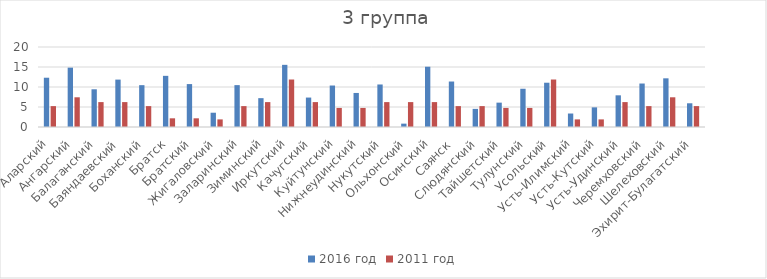
| Category | 2016 год | 2011 год |
|---|---|---|
| Аларский | 12.32 | 5.223 |
| Ангарский | 14.84 | 7.428 |
| Балаганский | 9.43 | 6.226 |
| Баяндаевский | 11.85 | 6.226 |
| Боханский | 10.46 | 5.223 |
| Братск | 12.79 | 2.172 |
| Братский | 10.73 | 2.172 |
| Жигаловский | 3.57 | 1.902 |
| Заларинский | 10.47 | 5.223 |
| Зиминский | 7.21 | 6.226 |
| Иркутский | 15.54 | 11.871 |
| Качугский | 7.36 | 6.226 |
| Куйтунский | 10.37 | 4.768 |
| Нижнеудинский | 8.51 | 4.768 |
| Нукутский | 10.63 | 6.226 |
| Ольхонский | 0.84 | 6.226 |
| Осинский | 15.07 | 6.226 |
| Саянск | 11.37 | 5.223 |
| Слюдянский | 4.53 | 5.223 |
| Тайшетский | 6.09 | 4.768 |
| Тулунский | 9.56 | 4.768 |
| Усольский | 11.07 | 11.871 |
| Усть-Илимский | 3.37 | 1.902 |
| Усть-Кутский | 4.91 | 1.902 |
| Усть-Удинский | 7.92 | 6.226 |
| Черемховский | 10.87 | 5.223 |
| Шелеховский | 12.17 | 7.428 |
| Эхирит-Булагатский | 5.93 | 5.223 |